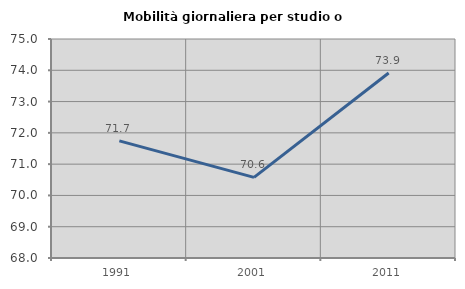
| Category | Mobilità giornaliera per studio o lavoro |
|---|---|
| 1991.0 | 71.744 |
| 2001.0 | 70.576 |
| 2011.0 | 73.913 |